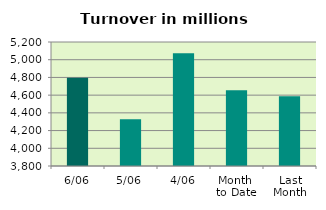
| Category | Series 0 |
|---|---|
| 6/06 | 4797.319 |
| 5/06 | 4326.755 |
| 4/06 | 5073.438 |
| Month 
to Date | 4654.496 |
| Last
Month | 4586.899 |